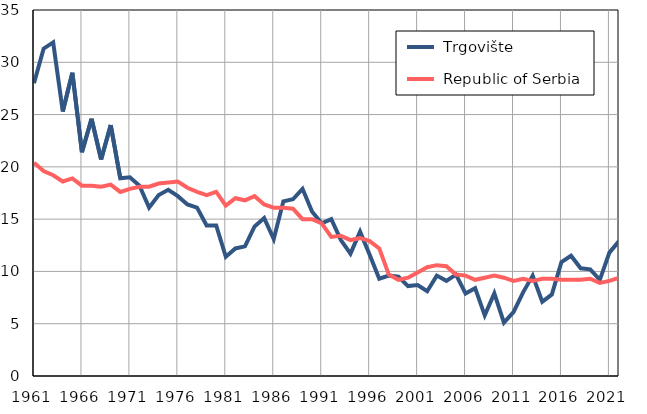
| Category |  Trgovište |  Republic of Serbia |
|---|---|---|
| 1961.0 | 28 | 20.4 |
| 1962.0 | 31.3 | 19.6 |
| 1963.0 | 31.9 | 19.2 |
| 1964.0 | 25.3 | 18.6 |
| 1965.0 | 29 | 18.9 |
| 1966.0 | 21.4 | 18.2 |
| 1967.0 | 24.6 | 18.2 |
| 1968.0 | 20.7 | 18.1 |
| 1969.0 | 24 | 18.3 |
| 1970.0 | 18.9 | 17.6 |
| 1971.0 | 19 | 17.9 |
| 1972.0 | 18.2 | 18.1 |
| 1973.0 | 16.1 | 18.1 |
| 1974.0 | 17.3 | 18.4 |
| 1975.0 | 17.8 | 18.5 |
| 1976.0 | 17.2 | 18.6 |
| 1977.0 | 16.4 | 18 |
| 1978.0 | 16.1 | 17.6 |
| 1979.0 | 14.4 | 17.3 |
| 1980.0 | 14.4 | 17.6 |
| 1981.0 | 11.4 | 16.3 |
| 1982.0 | 12.2 | 17 |
| 1983.0 | 12.4 | 16.8 |
| 1984.0 | 14.3 | 17.2 |
| 1985.0 | 15.1 | 16.4 |
| 1986.0 | 13.1 | 16.1 |
| 1987.0 | 16.7 | 16.1 |
| 1988.0 | 16.9 | 16 |
| 1989.0 | 17.9 | 15 |
| 1990.0 | 15.7 | 15 |
| 1991.0 | 14.6 | 14.6 |
| 1992.0 | 15 | 13.3 |
| 1993.0 | 13 | 13.4 |
| 1994.0 | 11.7 | 13 |
| 1995.0 | 13.8 | 13.2 |
| 1996.0 | 11.6 | 12.9 |
| 1997.0 | 9.3 | 12.2 |
| 1998.0 | 9.6 | 9.7 |
| 1999.0 | 9.5 | 9.2 |
| 2000.0 | 8.6 | 9.4 |
| 2001.0 | 8.7 | 9.9 |
| 2002.0 | 8.1 | 10.4 |
| 2003.0 | 9.6 | 10.6 |
| 2004.0 | 9.1 | 10.5 |
| 2005.0 | 9.7 | 9.7 |
| 2006.0 | 7.9 | 9.6 |
| 2007.0 | 8.4 | 9.2 |
| 2008.0 | 5.8 | 9.4 |
| 2009.0 | 7.9 | 9.6 |
| 2010.0 | 5.1 | 9.4 |
| 2011.0 | 6.1 | 9.1 |
| 2012.0 | 8 | 9.3 |
| 2013.0 | 9.6 | 9.1 |
| 2014.0 | 7.1 | 9.3 |
| 2015.0 | 7.8 | 9.3 |
| 2016.0 | 10.9 | 9.2 |
| 2017.0 | 11.5 | 9.2 |
| 2018.0 | 10.3 | 9.2 |
| 2019.0 | 10.2 | 9.3 |
| 2020.0 | 9.2 | 8.9 |
| 2021.0 | 11.8 | 9.1 |
| 2022.0 | 12.9 | 9.4 |